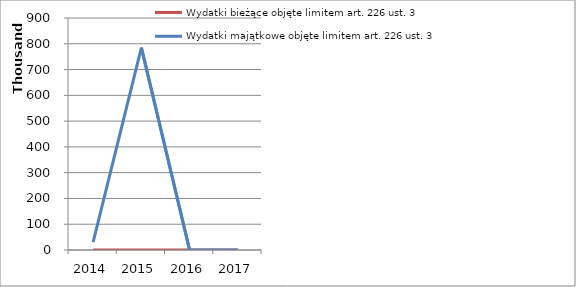
| Category | Wydatki bieżące objęte limitem art. 226 ust. 3 | Wydatki majątkowe objęte limitem art. 226 ust. 3 |
|---|---|---|
| 2014.0 | 0 | 30300 |
| 2015.0 | 0 | 784700 |
| 2016.0 | 0 | 0 |
| 2017.0 | 0 | 0 |